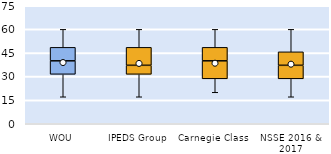
| Category | 25th | 50th | 75th |
|---|---|---|---|
| WOU | 31.429 | 8.571 | 8.571 |
| IPEDS Group | 31.429 | 5.714 | 11.429 |
| Carnegie Class | 28.571 | 11.429 | 8.571 |
| NSSE 2016 & 2017 | 28.571 | 8.571 | 8.571 |